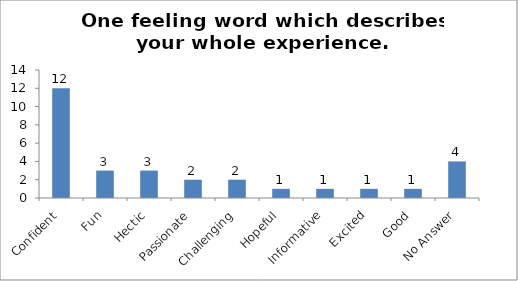
| Category | One feeling word which describes your whole experience. |
|---|---|
| Confident | 12 |
| Fun | 3 |
| Hectic | 3 |
| Passionate | 2 |
| Challenging | 2 |
| Hopeful | 1 |
| Informative | 1 |
| Excited | 1 |
| Good | 1 |
| No Answer | 4 |